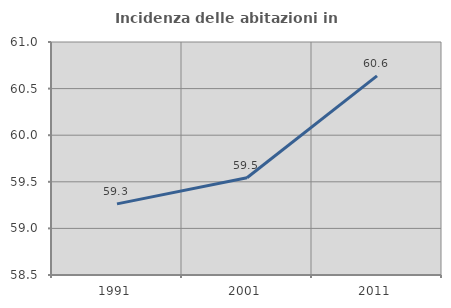
| Category | Incidenza delle abitazioni in proprietà  |
|---|---|
| 1991.0 | 59.263 |
| 2001.0 | 59.543 |
| 2011.0 | 60.637 |